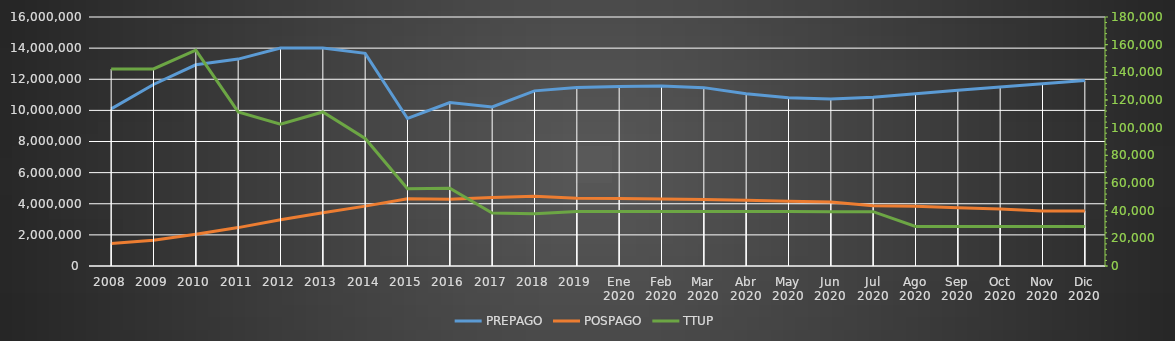
| Category | PREPAGO | POSPAGO |
|---|---|---|
| 2008 | 10097768 | 1452088 |
| 2009 | 11662294 | 1649838 |
| 2010 | 12929040 | 2033814 |
| 2011 | 13295834 | 2467378 |
| 2012 | 14008104 | 2976194 |
| 2013 | 14005126 | 3425277 |
| 2014 | 13666071 | 3846271 |
| 2015 | 9476240 | 4326937 |
| 2016 | 10498467 | 4293426 |
| 2017 | 10219457 | 4393703 |
| 2018 | 11254168 | 4480975 |
| 2019 | 11462048 | 4351686 |
| Ene 2020 | 11533220 | 4334391 |
| Feb 2020 | 11570642 | 4308478 |
| Mar 2020 | 11461517 | 4278370 |
| Abr 2020 | 11073657 | 4217911 |
| May 2020 | 10806656 | 4155948 |
| Jun 2020 | 10725910 | 4112569 |
| Jul 2020 | 10842756 | 3875020 |
| Ago 2020 | 11074748 | 3842518 |
| Sep 2020 | 11294219 | 3748130 |
| Oct 2020 | 11499640 | 3664524 |
| Nov 2020 | 11708585 | 3532266 |
| Dic 2020 | 11917697 | 3539192 |